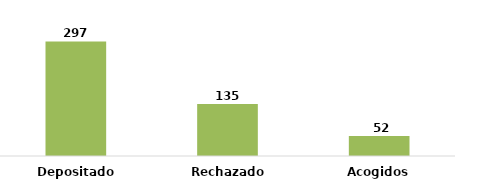
| Category | Series 0 |
|---|---|
| Depositados | 297 |
| Rechazados | 135 |
| Acogidos | 52 |